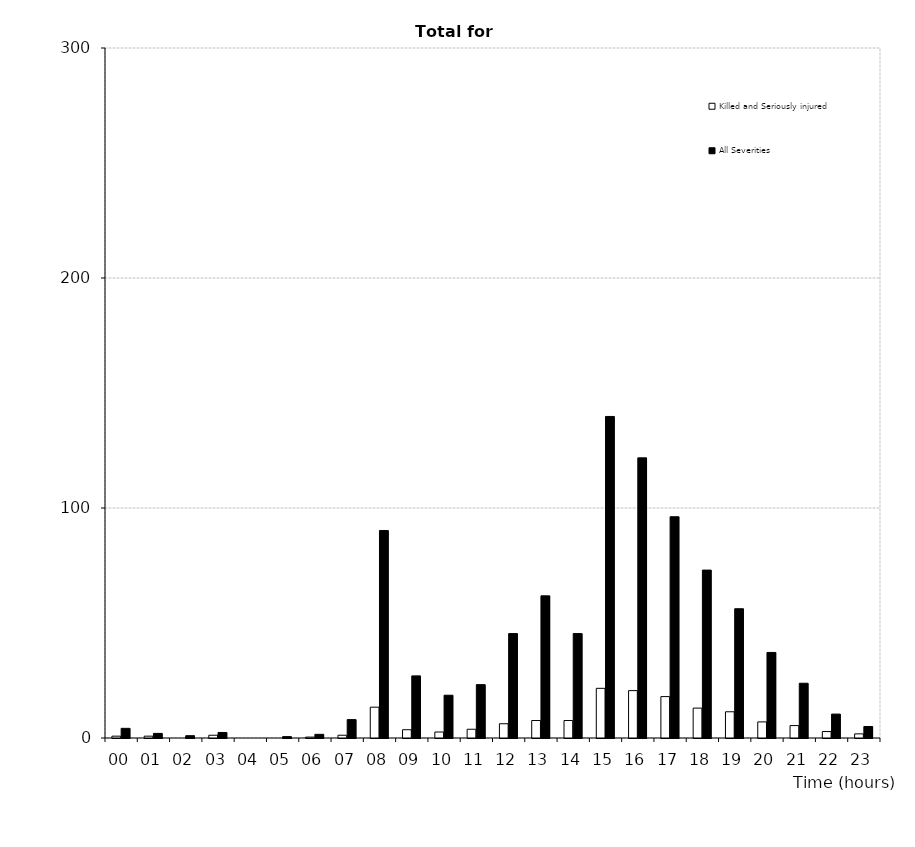
| Category | Killed and Seriously injured | All Severities |
|---|---|---|
| 00 | 0.8 | 4.2 |
| 01 | 0.8 | 2 |
| 02 | 0 | 1 |
| 03 | 1.2 | 2.4 |
| 04 | 0 | 0 |
| 05 | 0 | 0.6 |
| 06 | 0.4 | 1.6 |
| 07 | 1.2 | 8 |
| 08 | 13.4 | 90.2 |
| 09 | 3.6 | 27 |
| 10 | 2.6 | 18.6 |
| 11 | 3.8 | 23.2 |
| 12 | 6.2 | 45.4 |
| 13 | 7.6 | 61.8 |
| 14 | 7.6 | 45.4 |
| 15 | 21.6 | 139.8 |
| 16 | 20.6 | 121.8 |
| 17 | 18 | 96.2 |
| 18 | 13 | 73 |
| 19 | 11.4 | 56.2 |
| 20 | 7 | 37.2 |
| 21 | 5.4 | 23.8 |
| 22 | 2.8 | 10.4 |
| 23 | 1.8 | 5 |